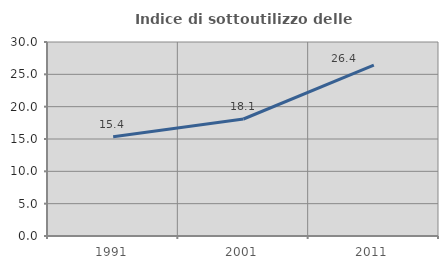
| Category | Indice di sottoutilizzo delle abitazioni  |
|---|---|
| 1991.0 | 15.359 |
| 2001.0 | 18.094 |
| 2011.0 | 26.433 |